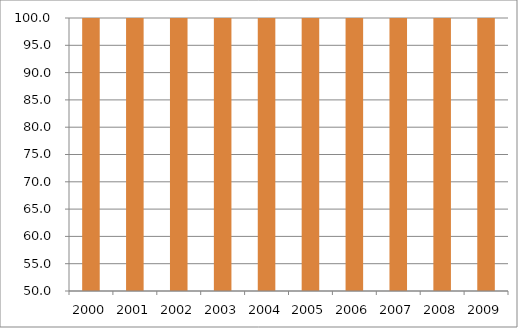
| Category | Região Centro-Oeste |
|---|---|
| 2000.0 | 116.04 |
| 2001.0 | 115.75 |
| 2002.0 | 113.88 |
| 2003.0 | 110.88 |
| 2004.0 | 113.04 |
| 2005.0 | 110.58 |
| 2006.0 | 107.67 |
| 2007.0 | 113.98 |
| 2008.0 | 112.53 |
| 2009.0 | 109.98 |